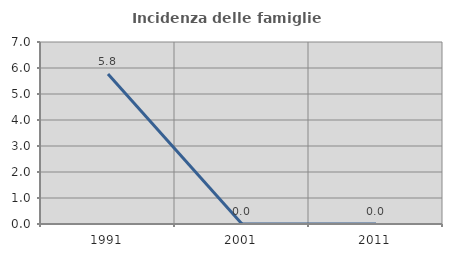
| Category | Incidenza delle famiglie numerose |
|---|---|
| 1991.0 | 5.769 |
| 2001.0 | 0 |
| 2011.0 | 0 |